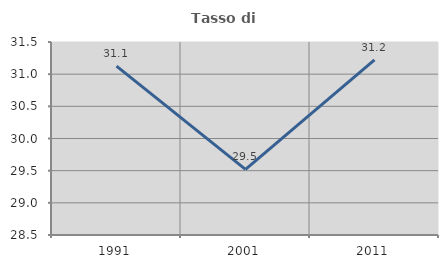
| Category | Tasso di occupazione   |
|---|---|
| 1991.0 | 31.126 |
| 2001.0 | 29.52 |
| 2011.0 | 31.223 |